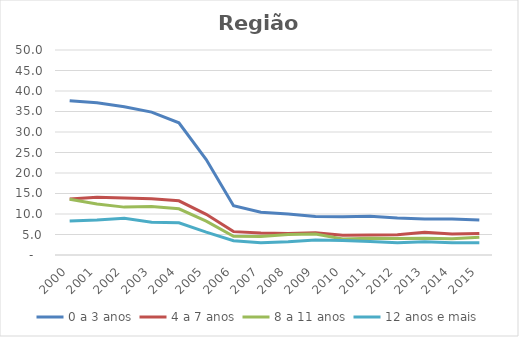
| Category | 0 a 3 anos | 4 a 7 anos | 8 a 11 anos | 12 anos e mais |
|---|---|---|---|---|
| 2000.0 | 37.641 | 13.636 | 13.617 | 8.273 |
| 2001.0 | 37.109 | 14.06 | 12.454 | 8.509 |
| 2002.0 | 36.174 | 13.882 | 11.679 | 8.937 |
| 2003.0 | 34.85 | 13.74 | 11.824 | 8.008 |
| 2004.0 | 32.253 | 13.223 | 11.258 | 7.846 |
| 2005.0 | 23.281 | 9.916 | 8.273 | 5.574 |
| 2006.0 | 12.035 | 5.701 | 4.575 | 3.492 |
| 2007.0 | 10.428 | 5.359 | 4.534 | 3.002 |
| 2008.0 | 10.02 | 5.256 | 5.028 | 3.229 |
| 2009.0 | 9.399 | 5.422 | 5.127 | 3.636 |
| 2010.0 | 9.308 | 4.838 | 3.881 | 3.556 |
| 2011.0 | 9.457 | 4.849 | 4.113 | 3.288 |
| 2012.0 | 9.005 | 4.943 | 4.034 | 2.974 |
| 2013.0 | 8.796 | 5.535 | 4.089 | 3.252 |
| 2014.0 | 8.805 | 5.107 | 3.937 | 2.99 |
| 2015.0 | 8.556 | 5.234 | 4.326 | 2.963 |